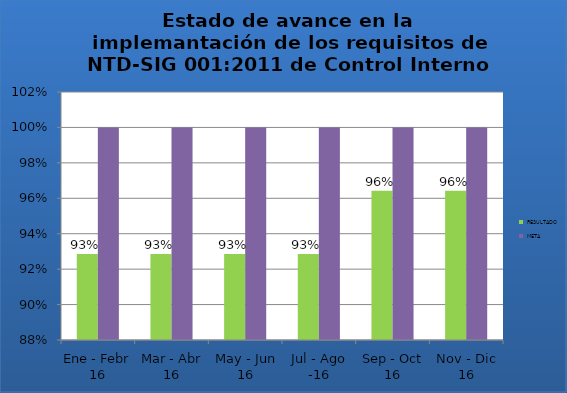
| Category | RESULTADO | META |
|---|---|---|
| Ene - Febr 16 | 0.929 | 1 |
| Mar - Abr 16 | 0.929 | 1 |
| May - Jun 16 | 0.929 | 1 |
| Jul - Ago -16 | 0.929 | 1 |
| Sep - Oct 16 | 0.964 | 1 |
| Nov - Dic 16 | 0.964 | 1 |